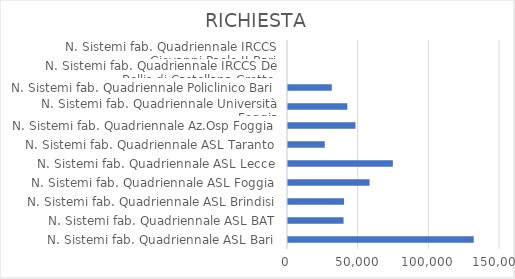
| Category | RICHIESTA |
|---|---|
| N. Sistemi fab. Quadriennale ASL Bari | 131400 |
| N. Sistemi fab. Quadriennale ASL BAT | 39300 |
| N. Sistemi fab. Quadriennale ASL Brindisi | 39660 |
| N. Sistemi fab. Quadriennale ASL Foggia | 57690 |
| N. Sistemi fab. Quadriennale ASL Lecce | 74180 |
| N. Sistemi fab. Quadriennale ASL Taranto | 26000 |
| N. Sistemi fab. Quadriennale Az.Osp Foggia | 47730 |
| N. Sistemi fab. Quadriennale Università Foggia | 41970 |
| N. Sistemi fab. Quadriennale Policlinico Bari | 30970 |
| N. Sistemi fab. Quadriennale IRCCS De Bellis di Castellana Grotte | 0 |
| N. Sistemi fab. Quadriennale IRCCS Giovanni Paolo II Bari | 0 |